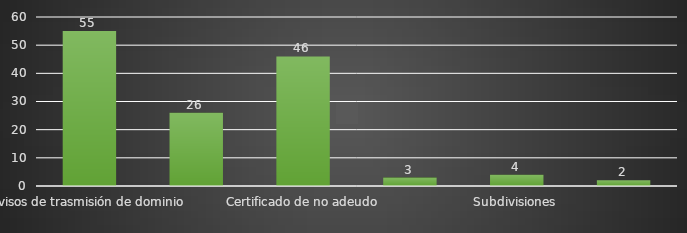
| Category | INDICADOR  |
|---|---|
| Avisos de trasmisión de dominio | 55 |
| Autorización de avalúos | 26 |
| Certificado de no adeudo | 46 |
| Historial catastral | 3 |
| Subdivisiones | 4 |
| Dictamen de valor para trasmisión de Titulo Corett | 2 |